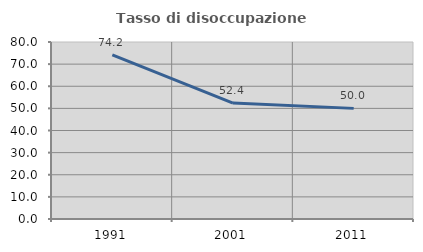
| Category | Tasso di disoccupazione giovanile  |
|---|---|
| 1991.0 | 74.194 |
| 2001.0 | 52.381 |
| 2011.0 | 50 |